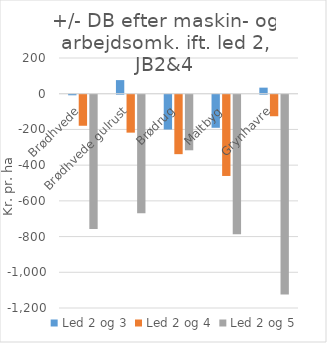
| Category | Led 2 og 3 | Led 2 og 4 | Led 2 og 5 |
|---|---|---|---|
| Brødhvede | -3.25 | -173.9 | -751.3 |
| Brødhvede gulrust | 76.25 | -212.4 | -663.3 |
| Brødrug | -194.923 | -332.923 | -311.215 |
| Maltbyg | -185.22 | -454.989 | -781 |
| Grynhavre | 33.95 | -120.55 | -1118.9 |